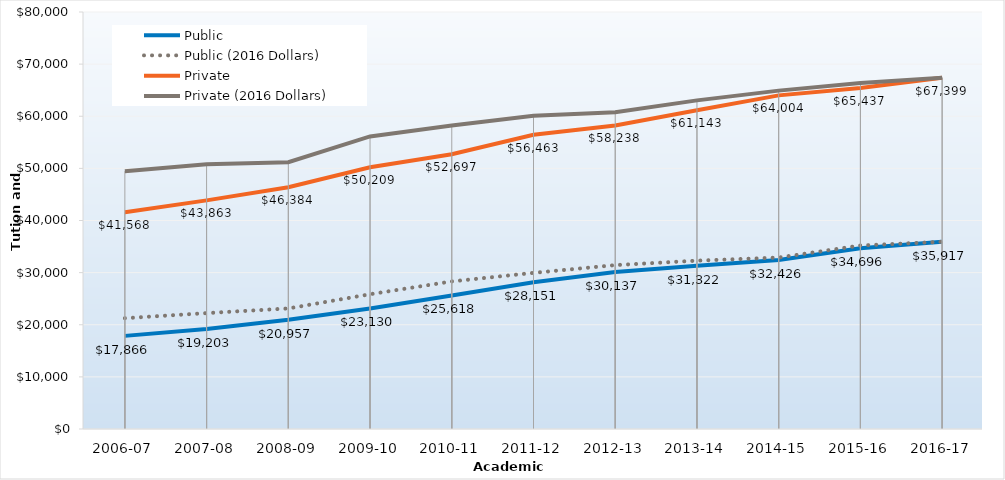
| Category | Public | Public (2016 Dollars) | Private | Private (2016 Dollars) |
|---|---|---|---|---|
| 2006-07 | 17866 | 21258.51 | 41568 | 49461.21 |
| 2007-08 | 19203 | 22236.76 | 43863 | 50792.63 |
| 2008-09 | 20957 | 23126.14 | 46384 | 51184.95 |
| 2009-10 | 23130 | 25856.63 | 50209 | 56127.77 |
| 2010-11 | 25618 | 28314.09 | 52697 | 58242.95 |
| 2011-12 | 28151 | 29954.91 | 56463 | 60081.14 |
| 2012-13 | 30137 | 31442.07 | 58238 | 60759.98 |
| 2013-14 | 31322 | 32295.71 | 61143 | 63043.76 |
| 2014-15 | 32426 | 32888.76 | 64004 | 64917.42 |
| 2015-16 | 34695.56 | 35203.87 | 65437.27 | 66394.86 |
| 2016-17 | 35916.95 | 35916.95 | 67398.89 | 67398.89 |